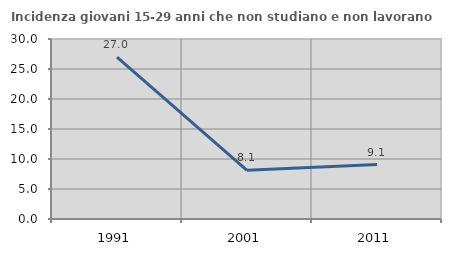
| Category | Incidenza giovani 15-29 anni che non studiano e non lavorano  |
|---|---|
| 1991.0 | 26.974 |
| 2001.0 | 8.112 |
| 2011.0 | 9.077 |